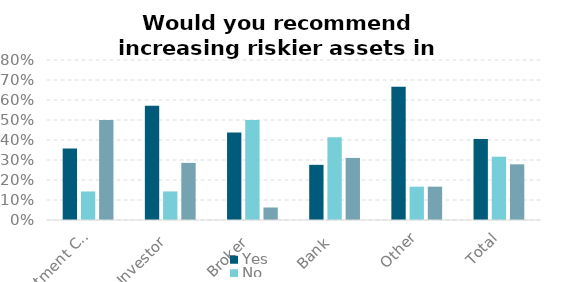
| Category | Yes | No | No change |
|---|---|---|---|
| Investment Consultant | 0.357 | 0.143 | 0.5 |
| Investor | 0.571 | 0.143 | 0.286 |
| Broker | 0.438 | 0.5 | 0.062 |
| Bank | 0.276 | 0.414 | 0.31 |
| Other | 0.667 | 0.167 | 0.167 |
| Total | 0.405 | 0.316 | 0.278 |